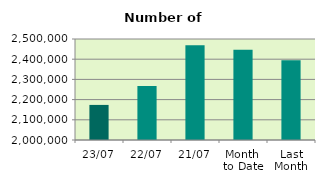
| Category | Series 0 |
|---|---|
| 23/07 | 2173682 |
| 22/07 | 2267522 |
| 21/07 | 2469180 |
| Month 
to Date | 2447066.941 |
| Last
Month | 2394428.455 |